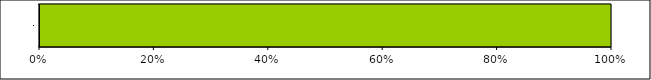
| Category | Series 0 | Series 1 | Series 2 | Series 3 |
|---|---|---|---|---|
| 0 | 0 | 0 | 5 | 0 |